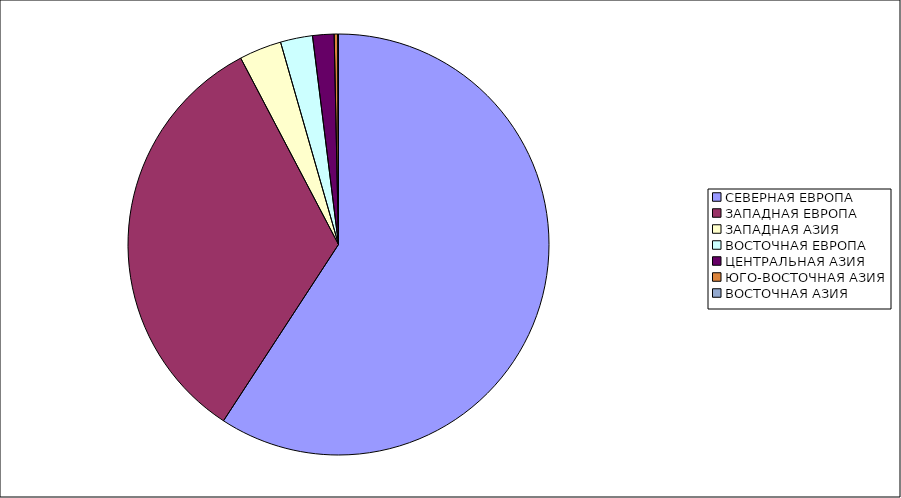
| Category | Оборот |
|---|---|
| СЕВЕРНАЯ ЕВРОПА | 59.199 |
| ЗАПАДНАЯ ЕВРОПА | 33.111 |
| ЗАПАДНАЯ АЗИЯ | 3.251 |
| ВОСТОЧНАЯ ЕВРОПА | 2.464 |
| ЦЕНТРАЛЬНАЯ АЗИЯ | 1.646 |
| ЮГО-ВОСТОЧНАЯ АЗИЯ | 0.272 |
| ВОСТОЧНАЯ АЗИЯ | 0.057 |